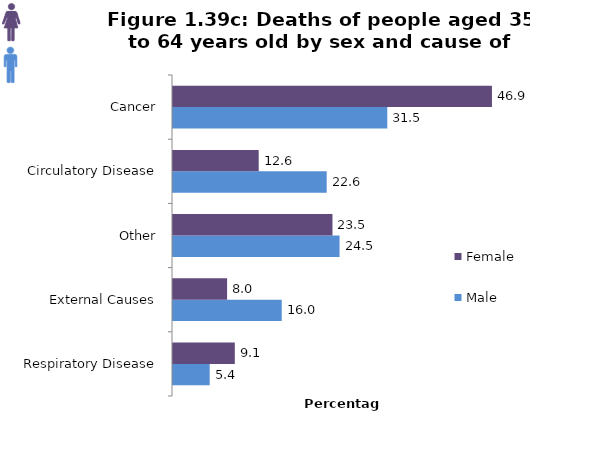
| Category | Male  | Female |
|---|---|---|
| Respiratory Disease | 5.398 | 9.091 |
| External Causes | 15.992 | 7.955 |
| Other | 24.494 | 23.45 |
| Circulatory Disease | 22.605 | 12.603 |
| Cancer | 31.511 | 46.901 |